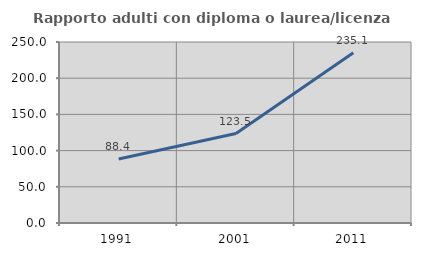
| Category | Rapporto adulti con diploma o laurea/licenza media  |
|---|---|
| 1991.0 | 88.372 |
| 2001.0 | 123.529 |
| 2011.0 | 235.135 |